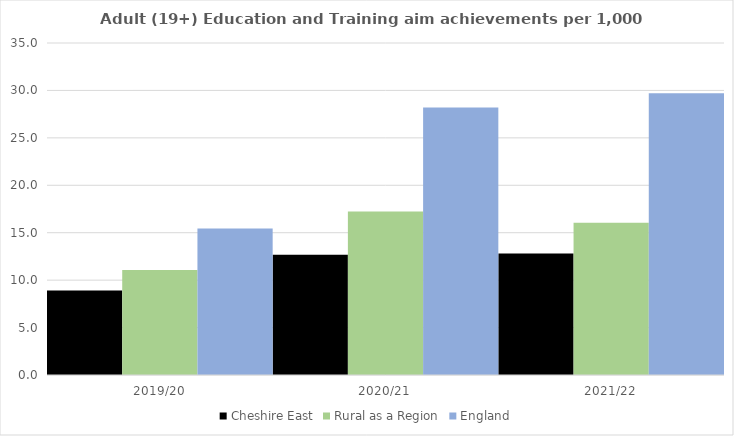
| Category | Cheshire East | Rural as a Region | England |
|---|---|---|---|
| 2019/20 | 8.914 | 11.081 | 15.446 |
| 2020/21 | 12.668 | 17.224 | 28.211 |
| 2021/22 | 12.811 | 16.063 | 29.711 |